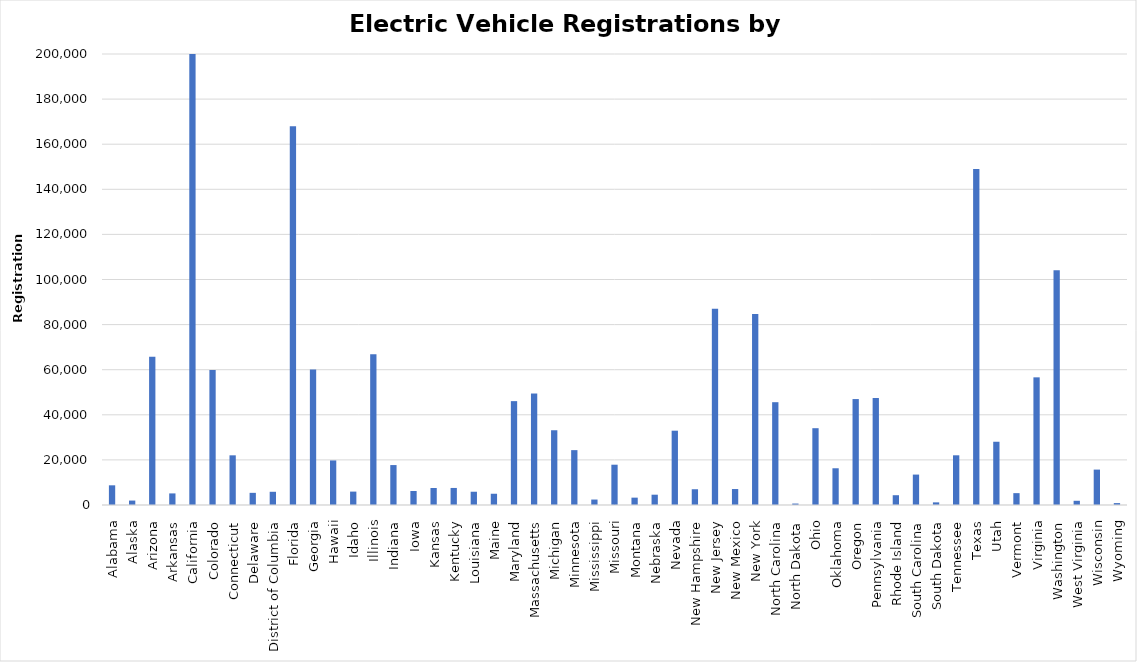
| Category |  Registration Count  |
|---|---|
| Alabama | 8730 |
| Alaska | 1970 |
| Arizona | 65780 |
| Arkansas | 5140 |
| California | 903620 |
| Colorado | 59910 |
| Connecticut | 22030 |
| Delaware | 5390 |
| District of Columbia | 5860 |
| Florida | 167990 |
| Georgia | 60120 |
| Hawaii | 19760 |
| Idaho | 5940 |
| Illinois | 66880 |
| Indiana | 17710 |
| Iowa | 6220 |
| Kansas | 7550 |
| Kentucky | 7560 |
| Louisiana | 5880 |
| Maine | 4990 |
| Maryland | 46060 |
| Massachusetts | 49440 |
| Michigan | 33150 |
| Minnesota | 24330 |
| Mississippi | 2420 |
| Missouri | 17870 |
| Montana | 3260 |
| Nebraska | 4570 |
| Nevada | 32950 |
| New Hampshire | 6990 |
| New Jersey | 87030 |
| New Mexico | 7080 |
| New York | 84670 |
| North Carolina | 45590 |
| North Dakota | 640 |
| Ohio | 34060 |
| Oklahoma | 16290 |
| Oregon | 46980 |
| Pennsylvania | 47440 |
| Rhode Island | 4340 |
| South Carolina | 13490 |
| South Dakota | 1170 |
| Tennessee | 22040 |
| Texas | 149000 |
| Utah | 28050 |
| Vermont | 5260 |
| Virginia | 56610 |
| Washington | 104050 |
| West Virginia | 1870 |
| Wisconsin | 15700 |
| Wyoming | 840 |